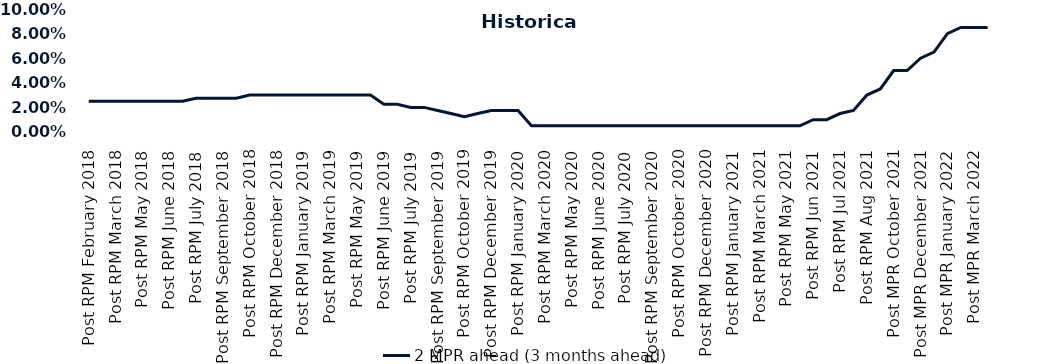
| Category | 2 MPR ahead (3 months ahead) |
|---|---|
| Post RPM February 2018 | 0.025 |
| Pre RPM March 2018 | 0.025 |
| Post RPM March 2018 | 0.025 |
| Pre RPM May 2018 | 0.025 |
| Post RPM May 2018 | 0.025 |
| Pre RPM June 2018 | 0.025 |
| Post RPM June 2018 | 0.025 |
| Pre RPM July 2018 | 0.025 |
| Post RPM July 2018 | 0.028 |
| Pre RPM September 2018 | 0.028 |
| Post RPM September 2018 | 0.028 |
| Pre RPM October 2018 | 0.028 |
| Post RPM October 2018 | 0.03 |
| Pre RPM December 2018 | 0.03 |
| Post RPM December 2018 | 0.03 |
| Pre RPM January 2019 | 0.03 |
| Post RPM January 2019 | 0.03 |
| Pre RPM March 2019 | 0.03 |
| Post RPM March 2019 | 0.03 |
| Pre RPM May 2019 | 0.03 |
| Post RPM May 2019 | 0.03 |
| Pre RPM June 2019 | 0.03 |
| Post RPM June 2019 | 0.022 |
| Pre RPM July 2019 | 0.022 |
| Post RPM July 2019 | 0.02 |
| Pre RPM September 2019 | 0.02 |
| Post RPM September 2019 | 0.018 |
| Pre RPM October 2019 | 0.015 |
| Post RPM October 2019 | 0.012 |
| Pre RPM December 2019 | 0.015 |
| Post RPM December 2019 | 0.018 |
| Pre RPM January 2020 | 0.018 |
| Post RPM January 2020 | 0.018 |
| Pre RPM March 2020 | 0.005 |
| Post RPM March 2020 | 0.005 |
| Pre RPM May 2020 | 0.005 |
| Post RPM May 2020 | 0.005 |
| Pre RPM June 2020 | 0.005 |
| Post RPM June 2020 | 0.005 |
| Pre RPM July 2020 | 0.005 |
| Post RPM July 2020 | 0.005 |
| Pre RPM September 2020 | 0.005 |
| Post RPM September 2020 | 0.005 |
| Pre RPM October 2020 | 0.005 |
| Post RPM October 2020 | 0.005 |
| Pre RPM December 2020 | 0.005 |
|  Post RPM December 2020 | 0.005 |
| Pre RPM January 2021 | 0.005 |
| Post RPM January 2021 | 0.005 |
|  Pre RPM March 2021 | 0.005 |
|  Post RPM March 2021 | 0.005 |
|  Pre RPM May 2021 | 0.005 |
|  Post RPM May 2021 | 0.005 |
|  Pre RPM Jun 2021 | 0.005 |
|   Post RPM Jun 2021 | 0.01 |
| Pre RPM Jul 2021 | 0.01 |
|  Post RPM Jul 2021 | 0.015 |
| Pre RPM Aug 2021 | 0.018 |
|  Post RPM Aug 2021 | 0.03 |
| Pre MPR October 2021 | 0.035 |
| Post MPR October 2021 | 0.05 |
| Pre MPR December 2021 | 0.05 |
| Post MPR December 2021 | 0.06 |
| Pre MPR January 2022 | 0.065 |
| Post MPR January 2022 | 0.08 |
| Pre MPR March 2022 | 0.085 |
| Post MPR March 2022 | 0.085 |
| Pre MPR May 2022 | 0.085 |